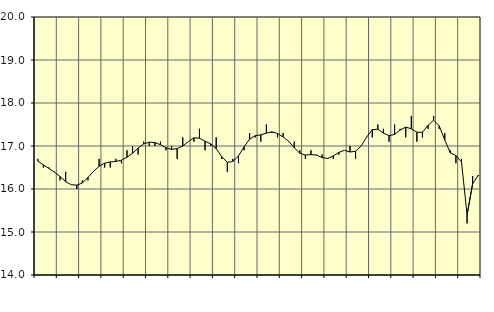
| Category | Piggar | Handel, SNI 45-47 |
|---|---|---|
| nan | 16.7 | 16.65 |
| 1.0 | 16.5 | 16.56 |
| 1.0 | 16.5 | 16.48 |
| 1.0 | 16.4 | 16.39 |
| nan | 16.2 | 16.29 |
| 2.0 | 16.4 | 16.17 |
| 2.0 | 16.1 | 16.1 |
| 2.0 | 16 | 16.09 |
| nan | 16.2 | 16.14 |
| 3.0 | 16.2 | 16.27 |
| 3.0 | 16.4 | 16.41 |
| 3.0 | 16.7 | 16.53 |
| nan | 16.5 | 16.6 |
| 4.0 | 16.5 | 16.63 |
| 4.0 | 16.7 | 16.64 |
| 4.0 | 16.6 | 16.67 |
| nan | 16.9 | 16.74 |
| 5.0 | 17 | 16.83 |
| 5.0 | 16.8 | 16.95 |
| 5.0 | 17.1 | 17.05 |
| nan | 17 | 17.09 |
| 6.0 | 17 | 17.08 |
| 6.0 | 17.1 | 17.03 |
| 6.0 | 16.9 | 16.96 |
| nan | 17 | 16.92 |
| 7.0 | 16.7 | 16.94 |
| 7.0 | 17.2 | 17 |
| 7.0 | 17.1 | 17.1 |
| nan | 17.1 | 17.19 |
| 8.0 | 17.4 | 17.18 |
| 8.0 | 16.9 | 17.11 |
| 8.0 | 17 | 17.05 |
| nan | 17.2 | 16.94 |
| 9.0 | 16.7 | 16.75 |
| 9.0 | 16.4 | 16.62 |
| 9.0 | 16.7 | 16.64 |
| nan | 16.6 | 16.77 |
| 10.0 | 16.9 | 16.98 |
| 10.0 | 17.3 | 17.16 |
| 10.0 | 17.2 | 17.24 |
| nan | 17.1 | 17.26 |
| 11.0 | 17.5 | 17.3 |
| 11.0 | 17.3 | 17.33 |
| 11.0 | 17.2 | 17.29 |
| nan | 17.3 | 17.21 |
| 12.0 | 17.1 | 17.11 |
| 12.0 | 17.1 | 16.96 |
| 12.0 | 16.9 | 16.83 |
| nan | 16.7 | 16.79 |
| 13.0 | 16.9 | 16.8 |
| 13.0 | 16.8 | 16.79 |
| 13.0 | 16.8 | 16.73 |
| nan | 16.7 | 16.71 |
| 14.0 | 16.7 | 16.77 |
| 14.0 | 16.8 | 16.85 |
| 14.0 | 16.9 | 16.9 |
| nan | 17 | 16.86 |
| 15.0 | 16.7 | 16.88 |
| 15.0 | 17 | 17 |
| 15.0 | 17.2 | 17.21 |
| nan | 17.2 | 17.38 |
| 16.0 | 17.5 | 17.39 |
| 16.0 | 17.4 | 17.3 |
| 16.0 | 17.1 | 17.24 |
| nan | 17.5 | 17.27 |
| 17.0 | 17.4 | 17.37 |
| 17.0 | 17.2 | 17.44 |
| 17.0 | 17.7 | 17.4 |
| nan | 17.1 | 17.32 |
| 18.0 | 17.2 | 17.32 |
| 18.0 | 17.4 | 17.48 |
| 18.0 | 17.7 | 17.6 |
| nan | 17.4 | 17.47 |
| 19.0 | 17.3 | 17.14 |
| 19.0 | 16.9 | 16.84 |
| 19.0 | 16.6 | 16.78 |
| nan | 16.7 | 16.63 |
| 20.0 | 15.2 | 15.4 |
| 20.0 | 16.3 | 16.12 |
| 20.0 | 16.3 | 16.32 |